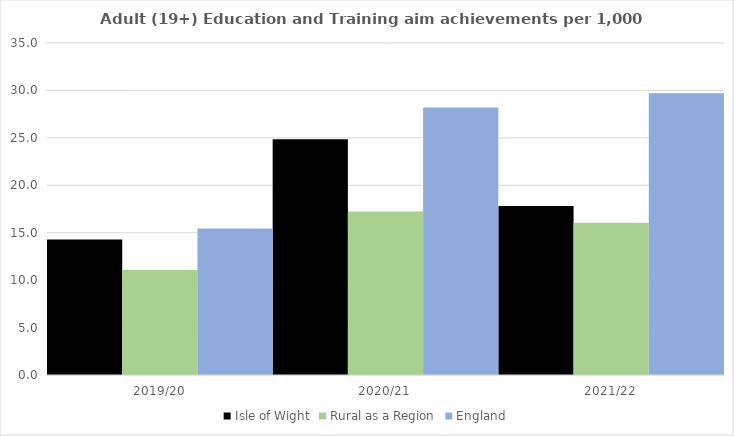
| Category | Isle of Wight | Rural as a Region | England |
|---|---|---|---|
| 2019/20 | 14.272 | 11.081 | 15.446 |
| 2020/21 | 24.842 | 17.224 | 28.211 |
| 2021/22 | 17.819 | 16.063 | 29.711 |